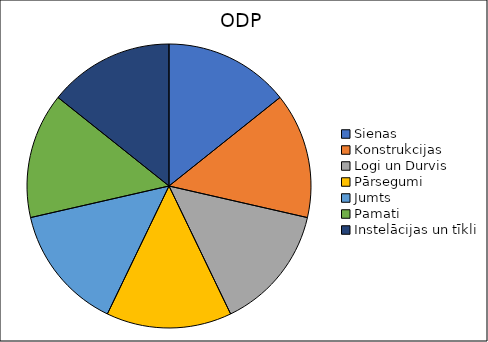
| Category | Sienas  |
|---|---|
| Sienas  | 0.002 |
| Konstrukcijas | 0.002 |
| Logi un Durvis | 0.002 |
| Pārsegumi | 0.002 |
| Jumts | 0.002 |
| Pamati | 0.002 |
| Instelācijas un tīkli | 0.002 |